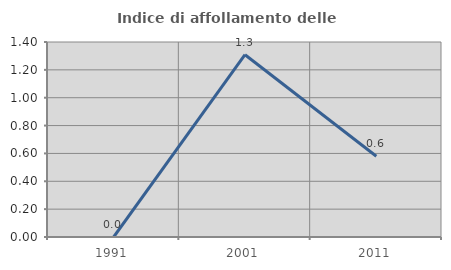
| Category | Indice di affollamento delle abitazioni  |
|---|---|
| 1991.0 | 0 |
| 2001.0 | 1.309 |
| 2011.0 | 0.58 |